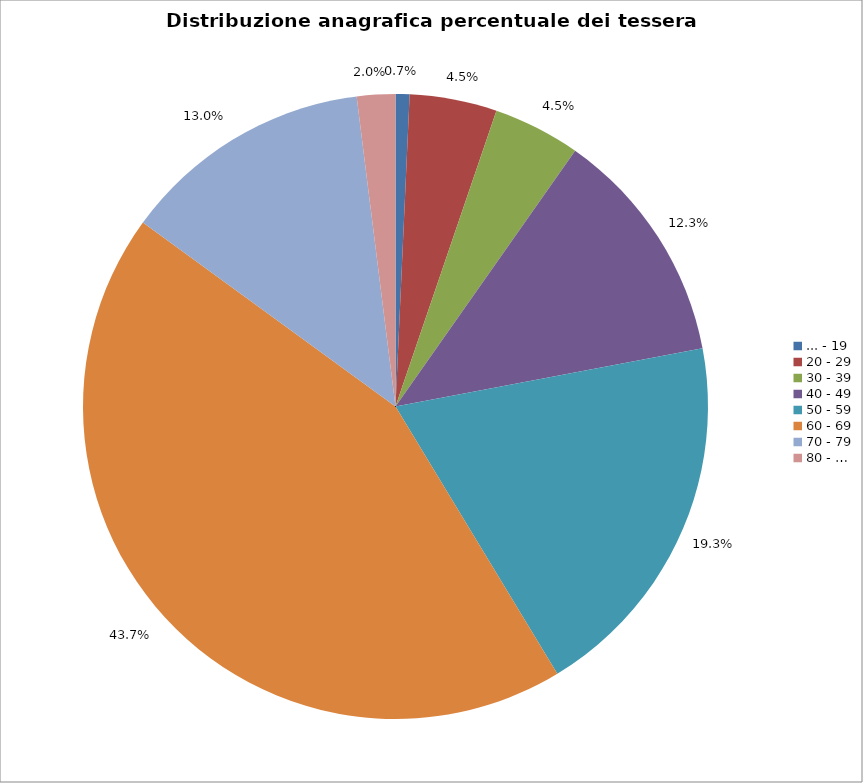
| Category | Nr. Tesserati |
|---|---|
| ... - 19 | 4 |
| 20 - 29 | 25 |
| 30 - 39 | 25 |
| 40 - 49 | 68 |
| 50 - 59 | 107 |
| 60 - 69 | 242 |
| 70 - 79 | 72 |
| 80 - … | 11 |